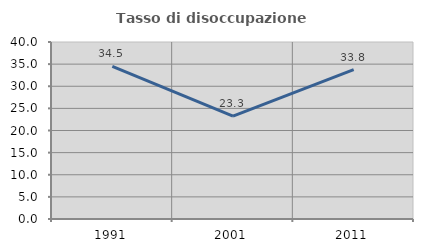
| Category | Tasso di disoccupazione giovanile  |
|---|---|
| 1991.0 | 34.483 |
| 2001.0 | 23.26 |
| 2011.0 | 33.75 |